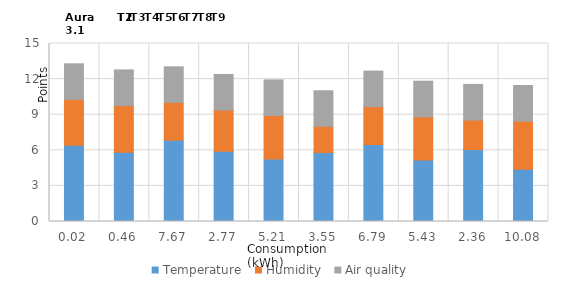
| Category | Temperature | Humidity | Air quality |
|---|---|---|---|
| 0.02 | 6.429 | 3.859 | 3 |
| 0.46 | 5.846 | 3.928 | 3 |
| 7.67 | 6.853 | 3.182 | 3 |
| 2.77 | 5.91 | 3.482 | 3 |
| 5.21 | 5.268 | 3.665 | 3 |
| 3.55 | 5.815 | 2.201 | 3 |
| 6.79 | 6.488 | 3.186 | 3 |
| 5.43 | 5.188 | 3.637 | 3 |
| 2.36 | 6.064 | 2.486 | 3 |
| 10.08 | 4.395 | 4.064 | 3 |